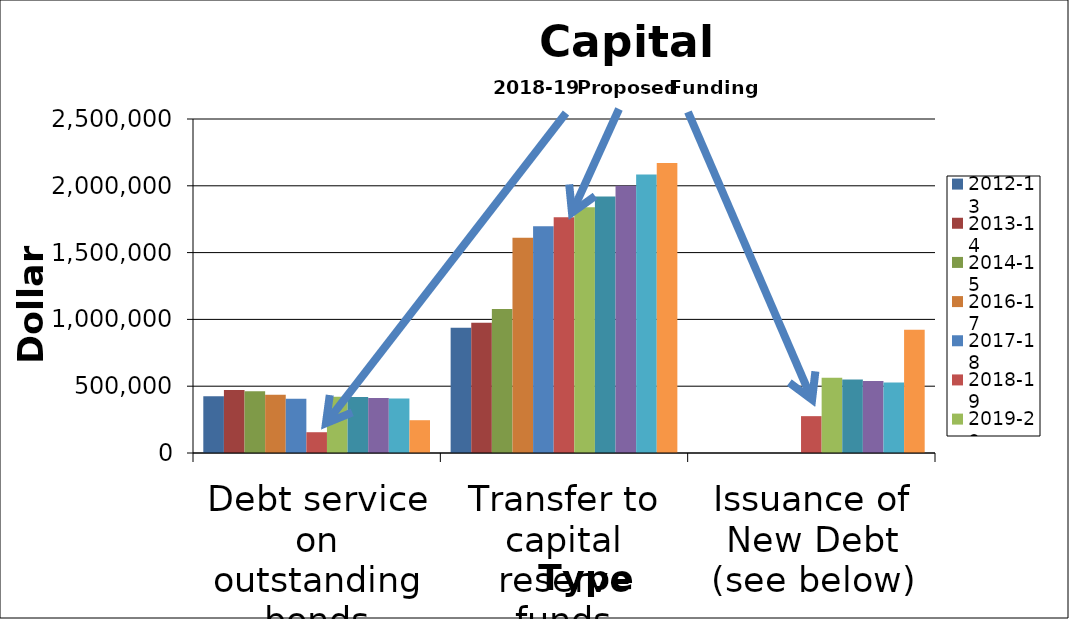
| Category | 2012-13 | 2013-14 | 2014-15 | 2015-16 | 2016-17 | 2017-18 | 2018-19 | 2019-20 | 2020-21 | 2021-22 | 2022-23 | 2023-24 |
|---|---|---|---|---|---|---|---|---|---|---|---|---|
| Debt service on outstanding bonds | 425405.5 | 472025.5 | 461396.75 |  | 435466 | 406500 | 155525 | 421038 | 419100 | 411969 | 407481 | 245438 |
| Transfer to capital reserve funds | 937000 | 974000 | 1077000 |  | 1612000 | 1697000 | 1765000 | 1840000 | 1920000 | 2000000 | 2085000 | 2170000 |
| Issuance of New Debt (see below) | 0 | 0 | 0 |  | 0 | 0 | 275825 | 562360 | 550994 | 539628 | 528262 | 923396 |